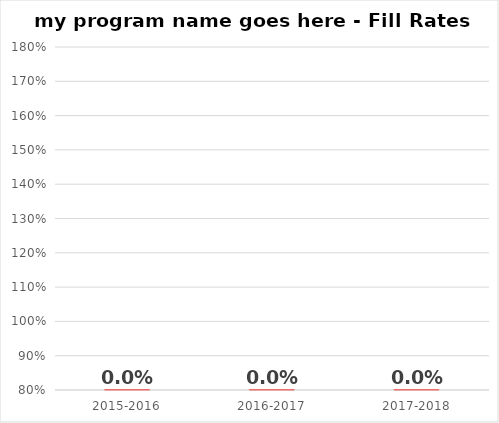
| Category | Fill |
|---|---|
| 2015-2016 | 0 |
| 2016-2017 | 0 |
| 2017-2018 | 0 |